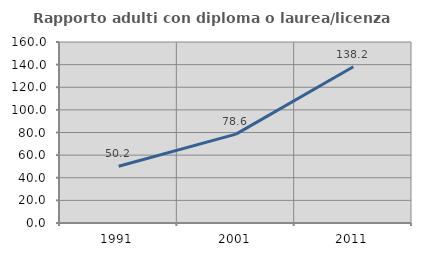
| Category | Rapporto adulti con diploma o laurea/licenza media  |
|---|---|
| 1991.0 | 50.151 |
| 2001.0 | 78.572 |
| 2011.0 | 138.182 |